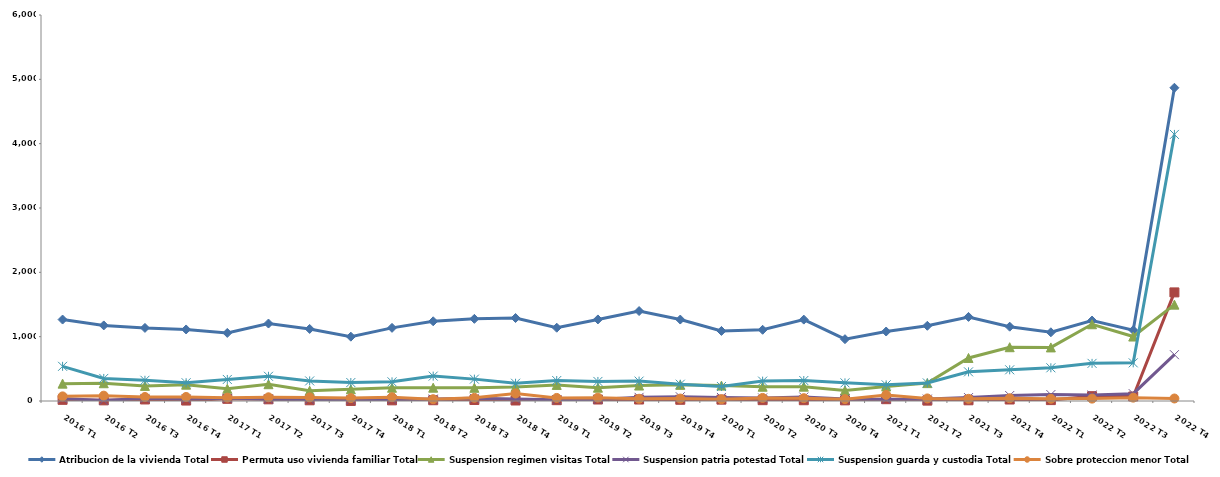
| Category | Atribucion de la vivienda Total | Permuta uso vivienda familiar Total | Suspension regimen visitas Total | Suspension patria potestad Total | Suspension guarda y custodia Total | Sobre proteccion menor Total |
|---|---|---|---|---|---|---|
| 2016 T1 | 1266 | 18 | 270 | 40 | 539 | 72 |
| 2016 T2 | 1175 | 10 | 276 | 9 | 351 | 83 |
| 2016 T3 | 1136 | 24 | 235 | 41 | 322 | 63 |
| 2016 T4 | 1112 | 7 | 254 | 31 | 284 | 63 |
| 2017 T1 | 1058 | 34 | 190 | 42 | 335 | 52 |
| 2017 T2 | 1204 | 26 | 261 | 27 | 384 | 58 |
| 2017 T3 | 1120 | 11 | 160 | 25 | 312 | 56 |
| 2017 T4 | 1000 | 1 | 182 | 22 | 287 | 45 |
| 2018 T1 | 1137 | 10 | 206 | 25 | 298 | 59 |
| 2018 T2 | 1239 | 12 | 207 | 30 | 387 | 28 |
| 2018 T3 | 1277 | 16 | 205 | 42 | 340 | 49 |
| 2018 T4 | 1290 | 8 | 217 | 33 | 276 | 117 |
| 2019 T1 | 1139 | 13 | 250 | 18 | 318 | 48 |
| 2019 T2 | 1268 | 23 | 207 | 24 | 304 | 52 |
| 2019 T3 | 1398 | 23 | 240 | 57 | 309 | 35 |
| 2019 T4 | 1266 | 19 | 251 | 66 | 261 | 38 |
| 2020 T1 | 1089 | 21 | 239 | 55 | 225 | 28 |
| 2020 T2 | 1107 | 13 | 222 | 47 | 309 | 48 |
| 2020 T3 | 1265 | 12 | 223 | 61 | 318 | 44 |
| 2020 T4 | 961 | 10 | 163 | 32 | 282 | 29 |
| 2021 T1 | 1080 | 28 | 225 | 26 | 251 | 95 |
| 2021 T2 | 1169 | 6 | 278 | 30 | 281 | 40 |
| 2021 T3 | 1307 | 11 | 669 | 53 | 453 | 34 |
| 2021 T4 | 1155 | 23 | 836 | 85 | 485 | 43 |
| 2022 T1 | 1068 | 14 | 833 | 100 | 516 | 35 |
| 2022 T2 | 1251 | 75 | 1193 | 93 | 585 | 37 |
| 2022 T3 | 1101 | 70 | 1002 | 114 | 593 | 52 |
| 2022 T4 | 4869 | 1688 | 1498 | 720 | 4144 | 39 |